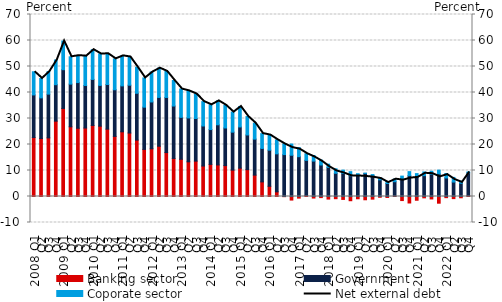
| Category | Banking sector | Government | Coporate sector |
|---|---|---|---|
|   2008 Q1 | 22.687 | 16.383 | 8.905 |
| Q2 | 22.302 | 15.632 | 7.464 |
| Q3 | 22.546 | 16.826 | 8.669 |
| Q4 | 28.975 | 14.03 | 9.491 |
|   2009 Q1 | 33.864 | 14.909 | 11.025 |
| Q2 | 26.811 | 16.412 | 10.515 |
| Q3 | 26.251 | 17.578 | 10.348 |
| Q4 | 26.341 | 16.359 | 11.274 |
|  2010 Q1 | 27.323 | 17.709 | 11.434 |
| Q2 | 27.05 | 15.677 | 12.099 |
| Q3 | 25.913 | 17.174 | 11.79 |
| Q4 | 23.117 | 17.938 | 11.88 |
|  2011 Q1 | 24.887 | 17.66 | 11.548 |
| Q2 | 24.412 | 18.395 | 10.845 |
| Q3 | 21.689 | 18.018 | 10.013 |
| Q4 | 18.104 | 16.258 | 11.245 |
|  2012 Q1 | 18.362 | 18.001 | 11.53 |
| Q2 | 19.341 | 18.758 | 11.252 |
| Q3 | 16.894 | 21.196 | 10.013 |
| Q4 | 14.629 | 20.171 | 9.826 |
|  2013 Q1 | 14.328 | 16.11 | 10.887 |
| Q2 | 13.34 | 16.882 | 10.367 |
| Q3 | 13.602 | 16.389 | 9.401 |
| Q4 | 11.723 | 15.4 | 9.37 |
|  2014 Q1 | 12.351 | 13.401 | 9.502 |
| Q2 | 12.137 | 15.448 | 9.187 |
| Q3 | 11.891 | 14.465 | 8.697 |
| Q4 | 10.149 | 14.601 | 7.703 |
|  2015 Q1 | 10.906 | 15.845 | 7.86 |
| Q2 | 10.329 | 13.34 | 7.084 |
| Q3 | 8.225 | 13.85 | 6.106 |
| Q4 | 5.629 | 12.857 | 5.704 |
|  2016 Q1 | 3.932 | 13.888 | 5.793 |
| Q2 | 1.8 | 14.612 | 5.376 |
| Q3 | -0.068 | 16.116 | 4.089 |
| Q4 | -1.368 | 15.868 | 4.316 |
|  2017 Q1 | -0.624 | 15.314 | 3.491 |
| Q2 | 0.346 | 13.558 | 2.536 |
| Q3 | -0.599 | 13.622 | 2.153 |
| Q4 | -0.426 | 12.115 | 1.875 |
|  2018 Q1 | -0.991 | 11.193 | 1.242 |
| Q2 | -0.842 | 8.939 | 1.709 |
| Q3 | -1.124 | 8.903 | 1.228 |
| Q4 | -1.622 | 8.007 | 1.552 |
|  2019 Q1 | -0.872 | 8.236 | 0.533 |
| Q2 | -1.257 | 8.898 | 0.063 |
| Q3 | -1.015 | 8.143 | 0.281 |
| Q4 | -0.294 | 6.406 | 0.781 |
|  2020 Q1 | -0.371 | 5.011 | 0.719 |
| Q2 | 0.137 | 5.551 | 0.982 |
| Q3 | -1.564 | 6.607 | 1.234 |
| Q4 | -2.495 | 8.008 | 1.557 |
| 2021 Q1 | -1.442 | 7.485 | 1.323 |
| Q2 | -0.52 | 8.016 | 1.433 |
| Q3 | -0.942 | 8.627 | 1.091 |
| Q4 | -2.575 | 8.685 | 1.449 |
| 2022 Q1 | -0.447 | 7.135 | 1.722 |
| Q2 | -0.815 | 5.559 | 1.785 |
| Q3 | -0.491 | 5.108 | 0.799 |
| Q4 | 0.247 | 8.876 | 0.325 |